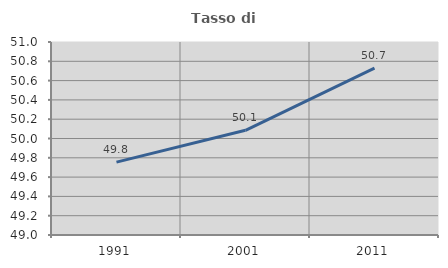
| Category | Tasso di occupazione   |
|---|---|
| 1991.0 | 49.755 |
| 2001.0 | 50.085 |
| 2011.0 | 50.73 |